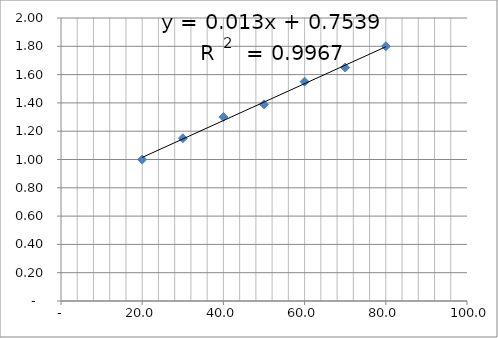
| Category | Series 0 |
|---|---|
| 20.0 | 1 |
| 30.0 | 1.15 |
| 40.0 | 1.3 |
| 50.0 | 1.39 |
| 60.0 | 1.55 |
| 70.0 | 1.65 |
| 80.0 | 1.8 |